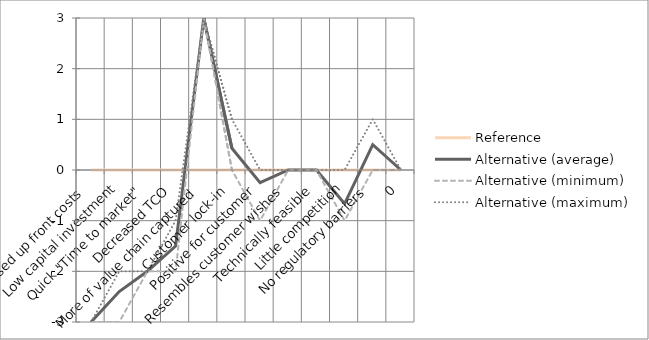
| Category | Reference | Alternative (average) | Alternative (minimum) | Alternative (maximum) |
|---|---|---|---|---|
| Decreased up front costs | 0 | -3 | -3 | -3 |
| Low capital investment | 0 | -2.4 | -3 | -2 |
| Quick "Time to market" | 0 | -2 | -2 | -2 |
| Decreased TCO | 0 | -1.5 | -2 | -1 |
| More of value chain captured | 0 | 3 | 3 | 3 |
| Customer lock-in | 0 | 0.429 | 0 | 1 |
| Positive for customer | 0 | -0.25 | -1 | 0 |
| Resembles customer wishes | 0 | 0 | 0 | 0 |
| Technically feasible | 0 | 0 | 0 | 0 |
| Little competition | 0 | -0.667 | -1 | 0 |
| No regulatory barriers | 0 | 0.5 | 0 | 1 |
| 0 | 0 | 0 | 0 | 0 |